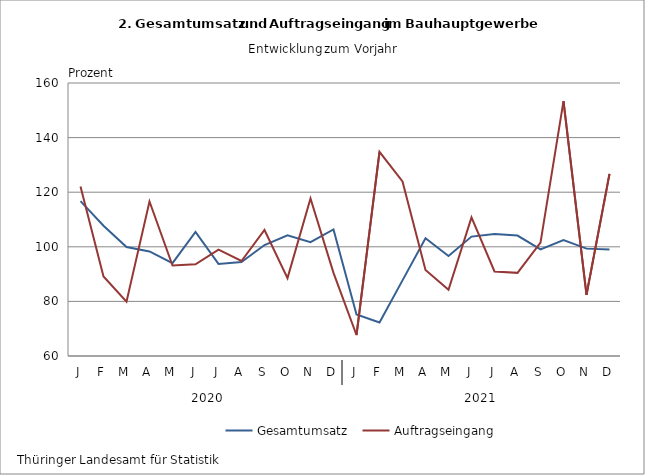
| Category | Gesamtumsatz | Auftragseingang |
|---|---|---|
| J | 116.725 | 122.12 |
| F | 107.715 | 89.154 |
| M | 99.901 | 79.879 |
| A | 98.299 | 116.618 |
| M | 93.996 | 93.128 |
| J | 105.476 | 93.604 |
| J | 93.732 | 98.986 |
| A | 94.426 | 94.802 |
| S | 100.653 | 106.153 |
| O | 104.206 | 88.533 |
| N | 101.695 | 117.678 |
| D | 106.365 | 90.443 |
| J | 75.225 | 67.682 |
| F | 72.306 | 134.798 |
| M | 87.703 | 123.955 |
| A | 103.164 | 91.521 |
| M | 96.603 | 84.237 |
| J | 103.739 | 110.796 |
| J | 104.686 | 90.977 |
| A | 104.131 | 90.459 |
| S | 99.046 | 101.504 |
| O | 102.501 | 153.34 |
| N | 99.331 | 82.429 |
| D | 99.019 | 126.721 |